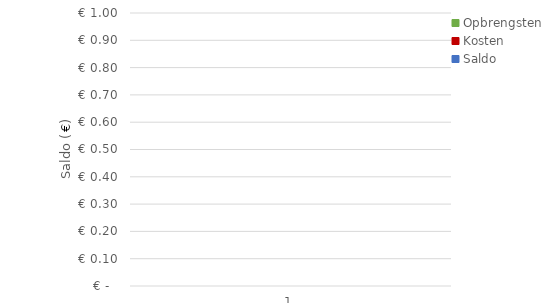
| Category | Opbrengsten | Kosten | Saldo |
|---|---|---|---|
| 0 | 0 | 0 | 0 |